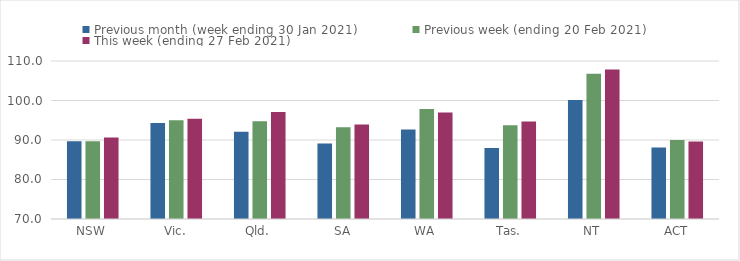
| Category | Previous month (week ending 30 Jan 2021) | Previous week (ending 20 Feb 2021) | This week (ending 27 Feb 2021) |
|---|---|---|---|
| NSW | 89.7 | 89.7 | 90.64 |
| Vic. | 94.29 | 95.01 | 95.36 |
| Qld. | 92.11 | 94.76 | 97.07 |
| SA | 89.13 | 93.21 | 93.92 |
| WA | 92.65 | 97.86 | 96.95 |
| Tas. | 87.99 | 93.75 | 94.69 |
| NT | 100.11 | 106.79 | 107.86 |
| ACT | 88.08 | 90 | 89.63 |